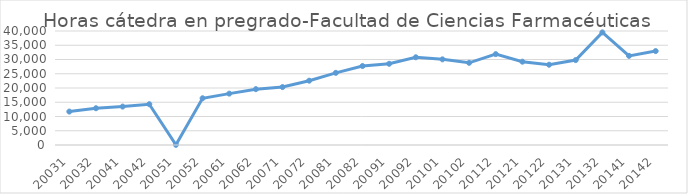
| Category | Total horas |
|---|---|
| 20031 | 11728 |
| 20032 | 12894 |
| 20041 | 13476 |
| 20042 | 14310 |
| 20051 | 60 |
| 20052 | 16403 |
| 20061 | 18023 |
| 20062 | 19596 |
| 20071 | 20326 |
| 20072 | 22567 |
| 20081 | 25318 |
| 20082 | 27708 |
| 20091 | 28495 |
| 20092 | 30781 |
| 20101 | 30051 |
| 20102 | 28836 |
| 20112 | 31883 |
| 20121 | 29231 |
| 20122 | 28165 |
| 20131 | 29790 |
| 20132 | 39515 |
| 20141 | 31279 |
| 20142 | 32949 |